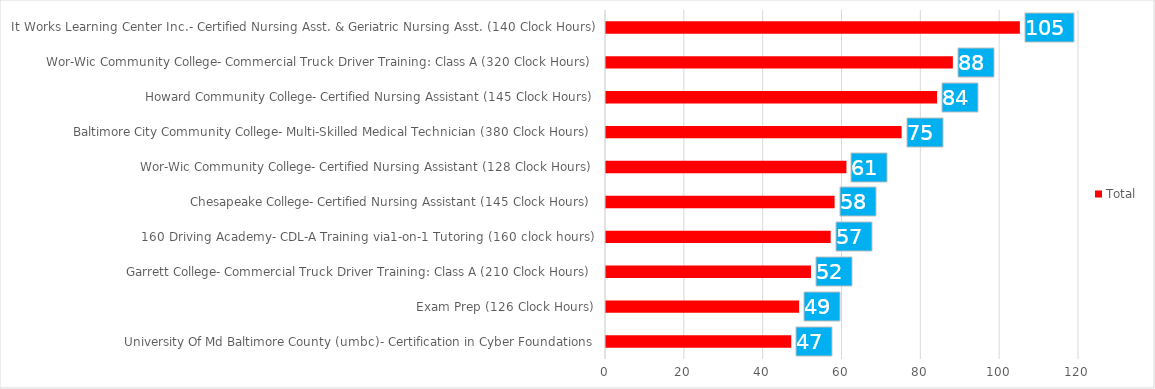
| Category | Total |
|---|---|
| University Of Md Baltimore County (umbc)- Certification in Cyber Foundations, Exam Prep (126 Clock Hours) | 47 |
| Garrett College- Commercial Truck Driver Training: Class A (210 Clock Hours) | 49 |
| 160 Driving Academy- CDL-A Training via1-on-1 Tutoring (160 clock hours) | 52 |
| Chesapeake College- Certified Nursing Assistant (145 Clock Hours) | 57 |
| Wor-Wic Community College- Certified Nursing Assistant (128 Clock Hours) | 58 |
| Baltimore City Community College- Multi-Skilled Medical Technician (380 Clock Hours) | 61 |
| Howard Community College- Certified Nursing Assistant (145 Clock Hours) | 75 |
| Wor-Wic Community College- Commercial Truck Driver Training: Class A (320 Clock Hours) | 84 |
| It Works Learning Center Inc.- Certified Nursing Asst. & Geriatric Nursing Asst. (140 Clock Hours) | 88 |
| Chesapeake College- Commercial Driver Licensing Prep Class A (280 Clock Hours) | 105 |